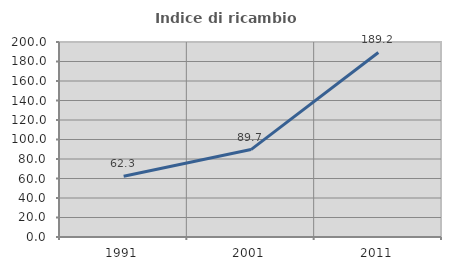
| Category | Indice di ricambio occupazionale  |
|---|---|
| 1991.0 | 62.26 |
| 2001.0 | 89.655 |
| 2011.0 | 189.247 |